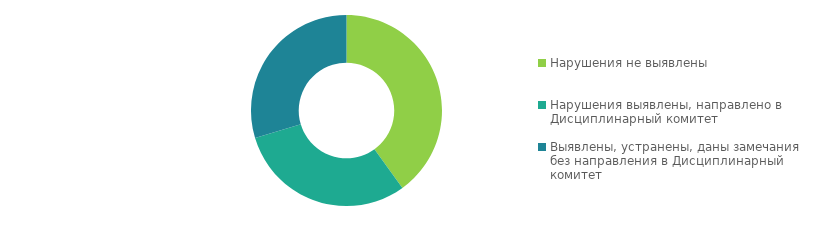
| Category | Series 0 |
|---|---|
| Нарушения не выявлены | 189 |
| Нарушения выявлены, направлено в Дисциплинарный комитет | 143 |
| Выявлены, устранены, даны замечания без направления в Дисциплинарный комитет | 140 |